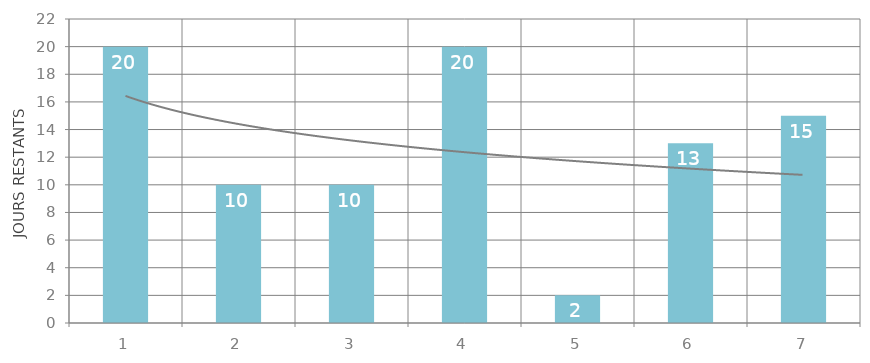
| Category | Total |
|---|---|
| 1 | 20 |
| 2 | 10 |
| 3 | 10 |
| 4 | 20 |
| 5 | 2 |
| 6 | 13 |
| 7 | 15 |